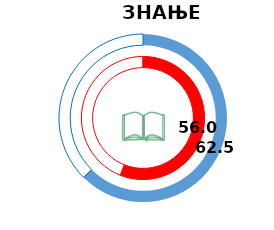
| Category | РС | Series 1 | ЕУ |
|---|---|---|---|
| 0 | 56 |  | 62.5 |
| 1 | 44 |  | 37.5 |